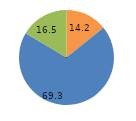
| Category | Series 0 |
|---|---|
| 0 | 14.2 |
| 1 | 69.3 |
| 2 | 16.5 |